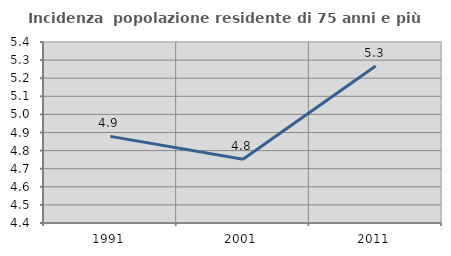
| Category | Incidenza  popolazione residente di 75 anni e più |
|---|---|
| 1991.0 | 4.879 |
| 2001.0 | 4.752 |
| 2011.0 | 5.267 |